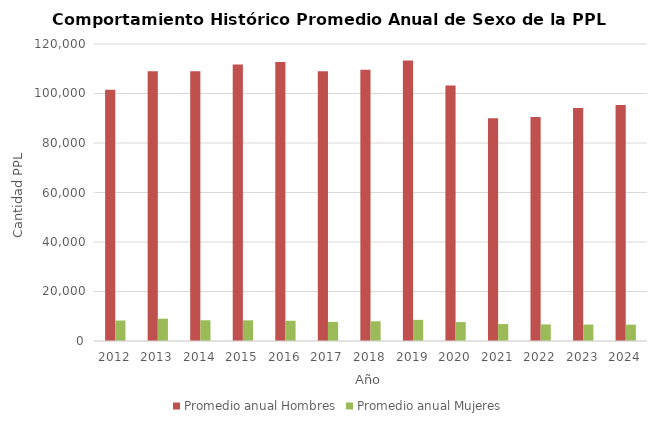
| Category | Promedio anual Hombres | Promedio anual Mujeres |
|---|---|---|
| 2012.0 | 101548.333 | 8273.75 |
| 2013.0 | 108988.333 | 8997.917 |
| 2014.0 | 109009.667 | 8379.417 |
| 2015.0 | 111689.083 | 8351 |
| 2016.0 | 112747 | 8167 |
| 2017.0 | 108939.917 | 7717.75 |
| 2018.0 | 109615.417 | 7954.167 |
| 2019.0 | 113308.833 | 8538.5 |
| 2020.0 | 103182.75 | 7647.583 |
| 2021.0 | 90002.917 | 6834.583 |
| 2022.0 | 90472.5 | 6703.417 |
| 2023.0 | 94091.083 | 6646.667 |
| 2024.0 | 95320 | 6614 |